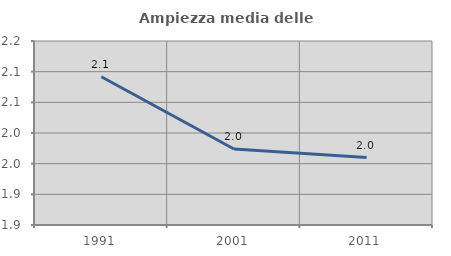
| Category | Ampiezza media delle famiglie |
|---|---|
| 1991.0 | 2.092 |
| 2001.0 | 1.974 |
| 2011.0 | 1.96 |